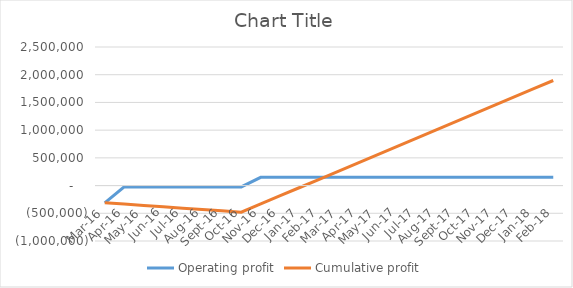
| Category | Operating profit | Cumulative profit |
|---|---|---|
| 2016-03-01 | -311282.468 | -311282.468 |
| 2016-04-01 | -22808.39 | -334090.857 |
| 2016-05-01 | -24374.948 | -358465.805 |
| 2016-06-01 | -24374.948 | -382840.753 |
| 2016-07-01 | -24374.948 | -407215.701 |
| 2016-08-01 | -24374.948 | -431590.649 |
| 2016-09-01 | -24374.948 | -455965.597 |
| 2016-10-01 | -24374.948 | -480340.545 |
| 2016-11-01 | 148497.052 | -331843.494 |
| 2016-12-01 | 148497.052 | -183346.442 |
| 2017-01-01 | 148497.052 | -34849.39 |
| 2017-02-01 | 148497.052 | 113647.662 |
| 2017-03-01 | 148497.052 | 262144.714 |
| 2017-04-01 | 148497.052 | 410641.766 |
| 2017-05-01 | 148497.052 | 559138.818 |
| 2017-06-01 | 148497.052 | 707635.87 |
| 2017-07-01 | 148497.052 | 856132.922 |
| 2017-08-01 | 148497.052 | 1004629.974 |
| 2017-09-01 | 148497.052 | 1153127.026 |
| 2017-10-01 | 148497.052 | 1301624.078 |
| 2017-11-01 | 148497.052 | 1450121.13 |
| 2017-12-01 | 148497.052 | 1598618.182 |
| 2018-01-01 | 148497.052 | 1747115.234 |
| 2018-02-01 | 148497.052 | 1895612.286 |